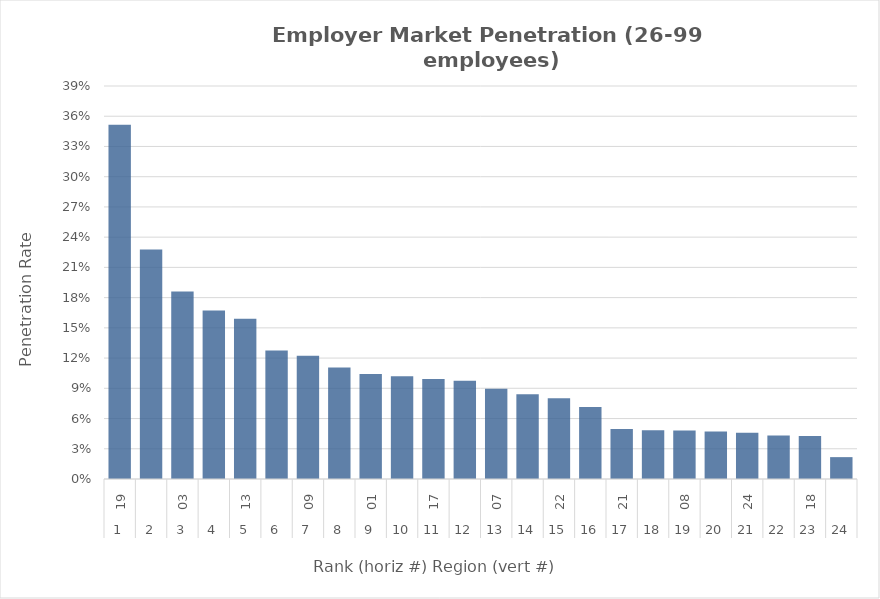
| Category | Rate |
|---|---|
| 0 | 0.352 |
| 1 | 0.228 |
| 2 | 0.186 |
| 3 | 0.167 |
| 4 | 0.159 |
| 5 | 0.128 |
| 6 | 0.122 |
| 7 | 0.111 |
| 8 | 0.104 |
| 9 | 0.102 |
| 10 | 0.099 |
| 11 | 0.097 |
| 12 | 0.089 |
| 13 | 0.084 |
| 14 | 0.08 |
| 15 | 0.071 |
| 16 | 0.05 |
| 17 | 0.048 |
| 18 | 0.048 |
| 19 | 0.047 |
| 20 | 0.046 |
| 21 | 0.043 |
| 22 | 0.043 |
| 23 | 0.022 |